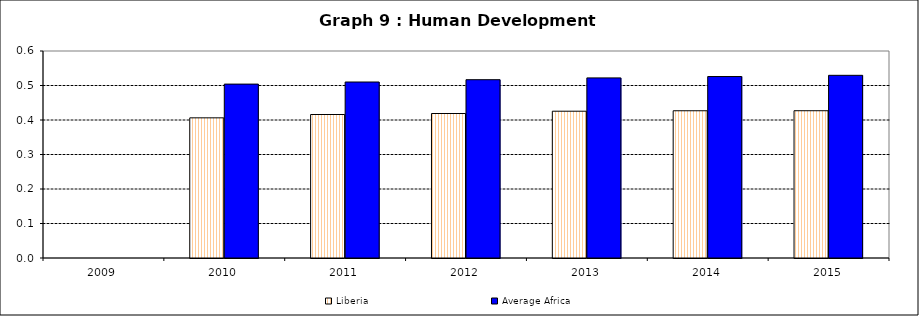
| Category | Liberia | Average Africa |
|---|---|---|
| 2009.0 | 0 | 0 |
| 2010.0 | 0.406 | 0.504 |
| 2011.0 | 0.416 | 0.51 |
| 2012.0 | 0.419 | 0.517 |
| 2013.0 | 0.425 | 0.522 |
| 2014.0 | 0.427 | 0.526 |
| 2015.0 | 0.427 | 0.53 |